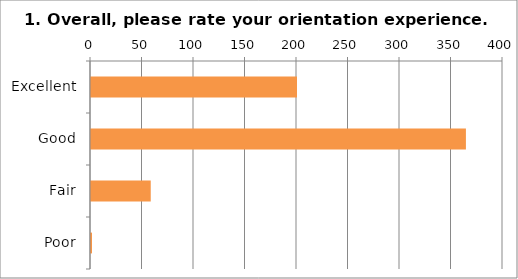
| Category | 1. Overall, please rate your orientation experience. |
|---|---|
| Excellent | 200 |
| Good | 364 |
| Fair | 58 |
| Poor | 1 |